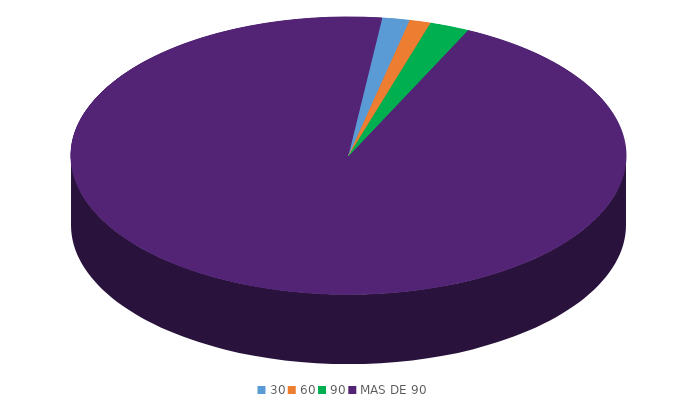
| Category | Series 0 |
|---|---|
| 30 | 555523.6 |
| 60 | 432757.7 |
| 90 | 803222.9 |
| MAS DE 90 | 33274827.1 |